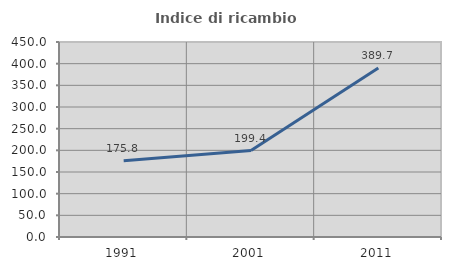
| Category | Indice di ricambio occupazionale  |
|---|---|
| 1991.0 | 175.822 |
| 2001.0 | 199.383 |
| 2011.0 | 389.735 |